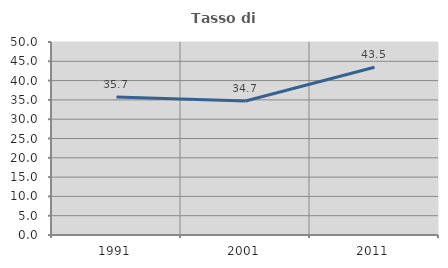
| Category | Tasso di occupazione   |
|---|---|
| 1991.0 | 35.733 |
| 2001.0 | 34.697 |
| 2011.0 | 43.45 |